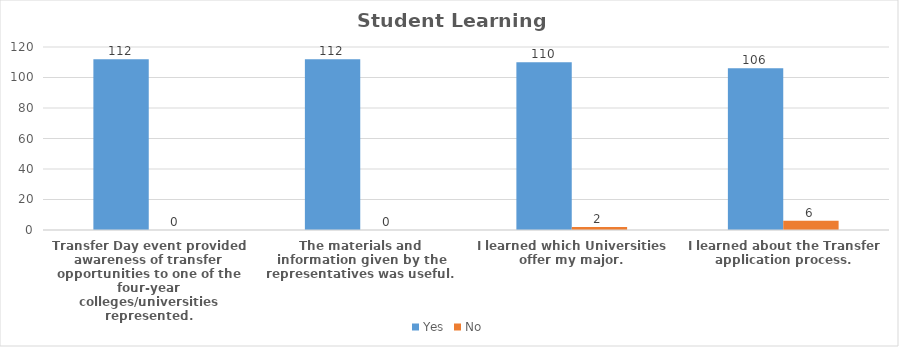
| Category | Yes | No |
|---|---|---|
| Transfer Day event provided awareness of transfer opportunities to one of the four-year colleges/universities represented. | 112 | 0 |
| The materials and information given by the representatives was useful. | 112 | 0 |
| I learned which Universities offer my major. | 110 | 2 |
| I learned about the Transfer application process. | 106 | 6 |